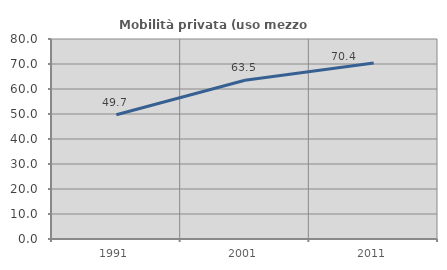
| Category | Mobilità privata (uso mezzo privato) |
|---|---|
| 1991.0 | 49.692 |
| 2001.0 | 63.529 |
| 2011.0 | 70.39 |